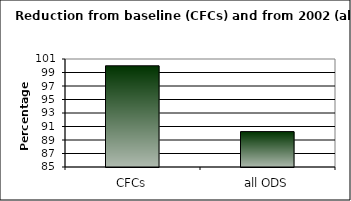
| Category | Series 0 |
|---|---|
| CFCs | 100 |
| all ODS | 90.248 |